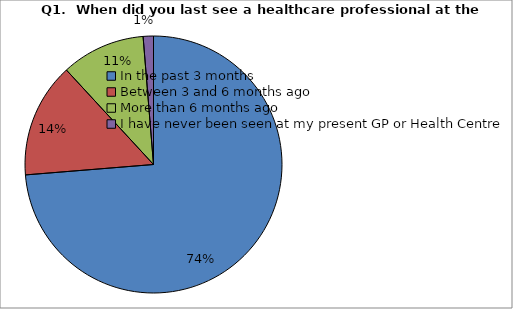
| Category | Series 0 |
|---|---|
| In the past 3 months | 342 |
| Between 3 and 6 months ago | 67 |
| More than 6 months ago | 49 |
| I have never been seen at my present GP or Health Centre | 6 |